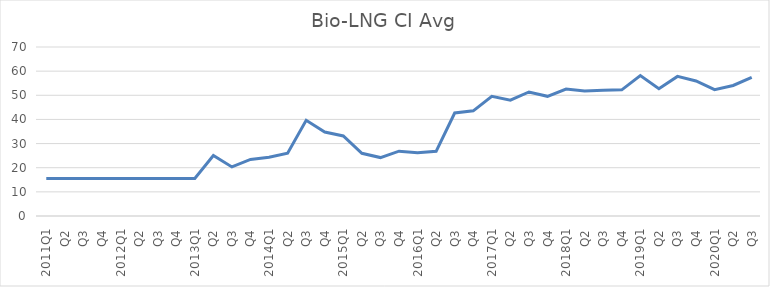
| Category | Bio-LNG CI Avg |
|---|---|
| 2011Q1 | 15.56 |
| Q2 | 15.56 |
| Q3 | 15.56 |
| Q4 | 15.56 |
| 2012Q1 | 15.56 |
| Q2 | 15.56 |
| Q3 | 15.56 |
| Q4 | 15.56 |
| 2013Q1 | 15.56 |
| Q2 | 25.06 |
| Q3 | 20.32 |
| Q4 | 23.42 |
| 2014Q1 | 24.31 |
| Q2 | 26 |
| Q3 | 39.65 |
| Q4 | 34.76 |
| 2015Q1 | 33.17 |
| Q2 | 25.96 |
| Q3 | 24.2 |
| Q4 | 26.86 |
| 2016Q1 | 26.17 |
| Q2 | 26.78 |
| Q3 | 42.66 |
| Q4 | 43.55 |
| 2017Q1 | 49.59 |
| Q2 | 47.97 |
| Q3 | 51.38 |
| Q4 | 49.57 |
| 2018Q1 | 52.59 |
| Q2 | 51.78 |
| Q3 | 52.1 |
| Q4 | 52.25 |
| 2019Q1 | 58.14 |
| Q2 | 52.69 |
| Q3 | 57.83 |
| Q4 | 55.92 |
| 2020Q1 | 52.31 |
| Q2 | 54.07 |
| Q3 | 57.42 |